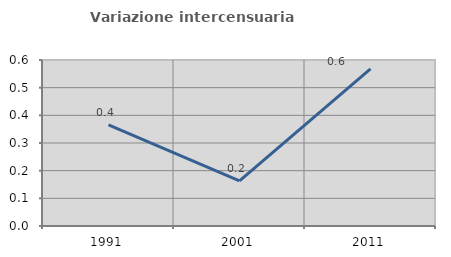
| Category | Variazione intercensuaria annua |
|---|---|
| 1991.0 | 0.366 |
| 2001.0 | 0.163 |
| 2011.0 | 0.568 |